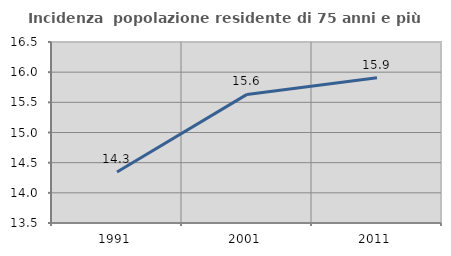
| Category | Incidenza  popolazione residente di 75 anni e più |
|---|---|
| 1991.0 | 14.345 |
| 2001.0 | 15.632 |
| 2011.0 | 15.909 |